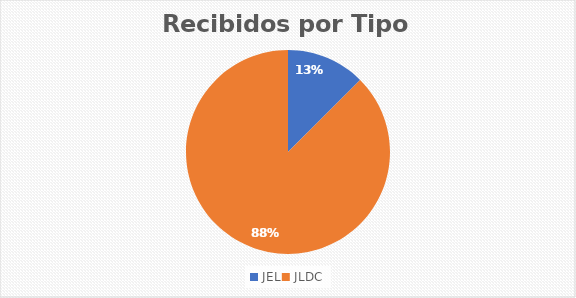
| Category | Series 0 |
|---|---|
| JEL | 1 |
| JLDC | 7 |